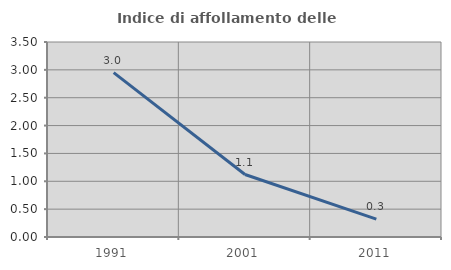
| Category | Indice di affollamento delle abitazioni  |
|---|---|
| 1991.0 | 2.951 |
| 2001.0 | 1.122 |
| 2011.0 | 0.322 |